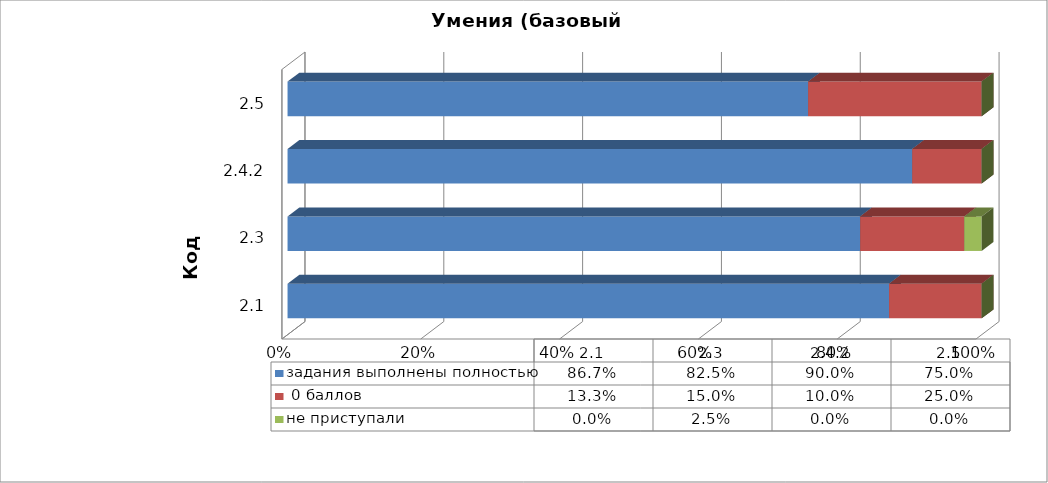
| Category | задания выполнены полностью |  0 баллов | не приступали |
|---|---|---|---|
| 2.1 | 0.867 | 0.133 | 0 |
| 2.3 | 0.825 | 0.15 | 0.025 |
| 2.4.2 | 0.9 | 0.1 | 0 |
| 2.5 | 0.75 | 0.25 | 0 |